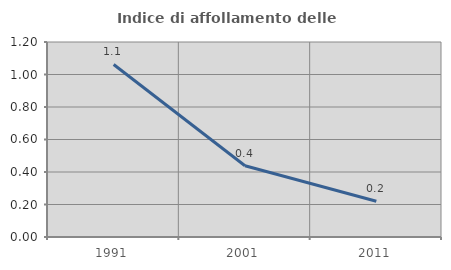
| Category | Indice di affollamento delle abitazioni  |
|---|---|
| 1991.0 | 1.062 |
| 2001.0 | 0.439 |
| 2011.0 | 0.22 |